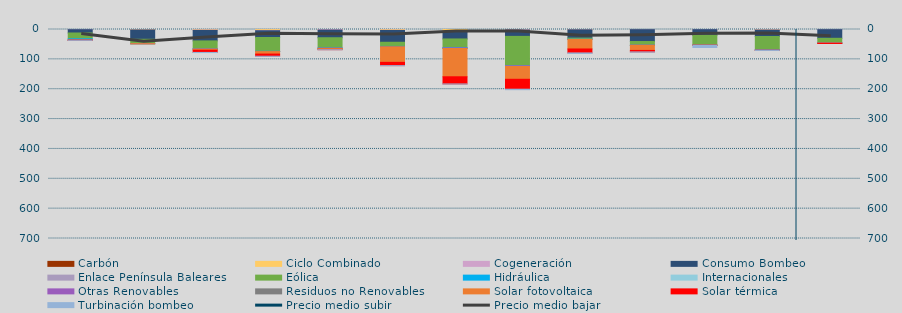
| Category | Carbón | Ciclo Combinado | Cogeneración | Consumo Bombeo | Enlace Península Baleares | Eólica | Hidráulica | Internacionales | Otras Renovables | Residuos no Renovables | Solar fotovoltaica | Solar térmica | Turbinación bombeo |
|---|---|---|---|---|---|---|---|---|---|---|---|---|---|
| 0 | 0 | 0 | 655.675 | 11045.084 | 0 | 19430.531 | 3297.137 | 0 | 1221.2 | 4.575 | 380.934 | 279.19 | 100 |
| 1 | 0 | 1578.425 | 97.391 | 31105.358 | 0 | 14760.555 | 0.525 | 0 | 6.9 | 0 | 610.128 | 0 | 0 |
| 2 | 0 | 1682.35 | 1288.318 | 35237.998 | 0 | 26715.501 | 538.936 | 0 | 327.466 | 97.457 | 3459.795 | 7401.339 | 450.583 |
| 3 | 0 | 2896.525 | 1320.794 | 22481.384 | 0 | 46423.207 | 245.293 | 0 | 655.227 | 248.362 | 8080.179 | 7222.305 | 292.5 |
| 4 | 0 | 199.85 | 1687.618 | 25714.166 | 0 | 34475.114 | 354.461 | 0 | 851.955 | 108.267 | 3215.484 | 949.057 | 183.208 |
| 5 | 0 | 2332.325 | 837.542 | 39583.668 | 0 | 13865.681 | 874.017 | 0 | 764.251 | 122.4 | 51660.192 | 10959.39 | 140 |
| 6 | 0 | 8570.193 | 1044.542 | 22062.469 | 0 | 29099.06 | 778.521 | 0 | 1951.311 | 135.5 | 94698.2 | 24041.497 | 242.133 |
| 7 | 0 | 898.7 | 918.519 | 21253.542 | 0 | 97910.858 | 671.55 | 0 | 1839.655 | 0 | 43222.778 | 33235.192 | 1586.933 |
| 8 | 0 | 958.3 | 215.177 | 27683.021 | 0 | 3999.405 | 139.925 | 0 | 560.625 | 0 | 31670.609 | 13214.049 | 1776.567 |
| 9 | 0 | 186.85 | 413.567 | 39689.899 | 0 | 12288.729 | 55.808 | 0 | 97.266 | 235.032 | 17134.015 | 4971.407 | 695.217 |
| 10 | 0 | 3.75 | 528.098 | 18641.496 | 0 | 32691.319 | 287.654 | 0 | 22.882 | 0 | 968.157 | 287.639 | 6902.5 |
| 11 | 0 | 1374.075 | 765.468 | 21378.15 | 0 | 44180.543 | 1412.165 | 0 | 335.383 | 0 | 163.086 | 136.883 | 470.8 |
| 12 | 0 | 0 | 519.226 | 28959.426 | 0 | 15518.136 | 121.525 | 0 | 170.661 | 291.704 | 675.246 | 466.6 | 0 |